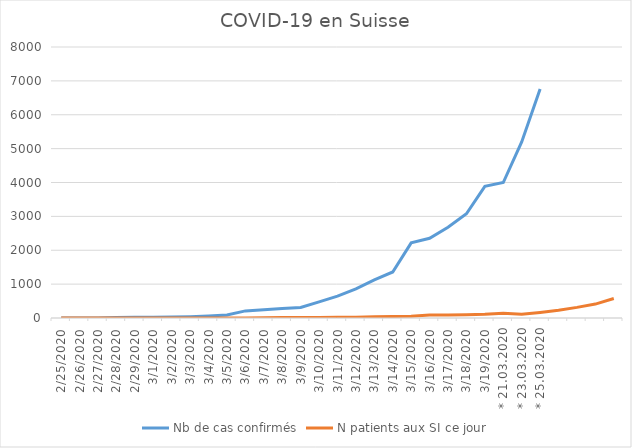
| Category | Nb de cas confirmés | N patients aux SI ce jour |
|---|---|---|
| 25.02.2020 | 1 | 0 |
| 26.02.2020 | 1 | 0 |
| 27.02.2020 | 3 | 0 |
| 28.02.2020 | 15 | 0 |
| 29.02.2020 | 20 | 1 |
| 01.03.2020 | 25 | 1 |
| 02.03.2020 | 27 | 1 |
| 03.03.2020 | 37 | 1 |
| 04.03.2020 | 58 | 2 |
| 05.03.2020 | 87 | 2.2 |
| 06.03.2020 | 210 | 3.2 |
| 07.03.2020 | 246 | 9.2 |
| 08.03.2020 | 281 | 11.2 |
| 09.03.2020 | 312 | 12.4 |
| 10.03.2020 | 476 | 13.6 |
| 11.03.2020 | 645 | 20.8 |
| 12.03.2020 | 858 | 24 |
| 13.03.2020 | 1125 | 33.4 |
| 14.03.2020 | 1359 | 44.6 |
| 15.03.2020 | 2217 | 55 |
| 16.03.2020 | 2353 | 91.6 |
| 17.03.2020 | 2677 | 92.2 |
| 18.03.2020 | 3076 | 99.2 |
| 19.03.2020 | 3888 | 108.6 |
| * 21.03.2020 | 3999 | 139.8 |
| * 23.03.2020 | 5198 | 110.2 |
| * 25.03.2020 | 6758 | 164.2 |